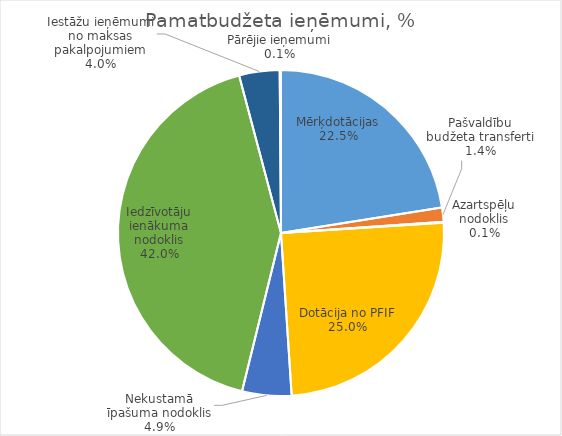
| Category | Series 0 |
|---|---|
| Mērķdotācijas | 5659131 |
| Pašvaldību budžeta transferti | 357000 |
| Azartspēļu nodoklis | 20000 |
| Dotācija no PFIF | 6282296 |
| Nekustamā īpašuma nodoklis | 1230207 |
| Iedzīvotāju ienākuma nodoklis | 10573284 |
| Iestāžu ieņēmumi no maksas pakalpojumiem | 1008825 |
| Pārējie ieņemumi | 32241 |